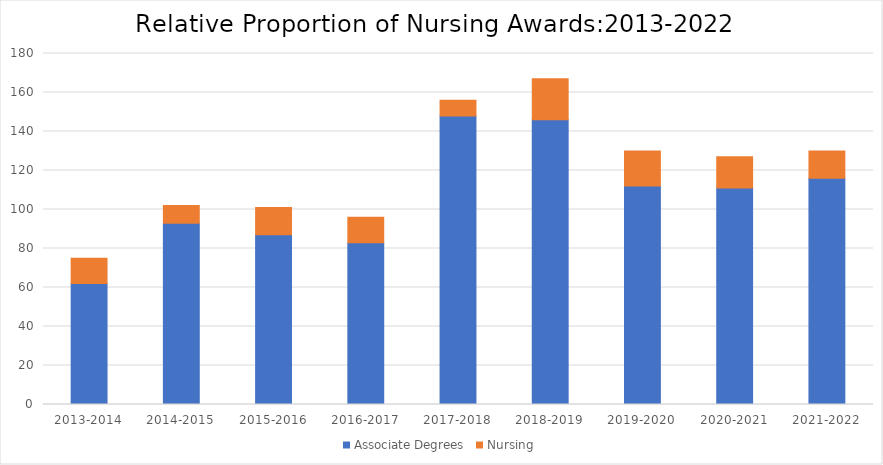
| Category | Associate Degrees | Nursing |
|---|---|---|
| 2013-2014 | 62 | 13 |
| 2014-2015 | 93 | 9 |
| 2015-2016 | 87 | 14 |
| 2016-2017 | 83 | 13 |
| 2017-2018 | 148 | 8 |
| 2018-2019 | 146 | 21 |
| 2019-2020 | 112 | 18 |
| 2020-2021 | 111 | 16 |
| 2021-2022 | 116 | 14 |